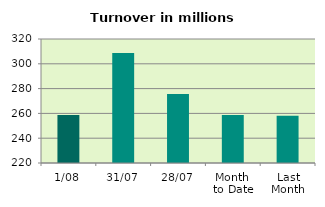
| Category | Series 0 |
|---|---|
| 1/08 | 258.743 |
| 31/07 | 308.8 |
| 28/07 | 275.631 |
| Month 
to Date | 258.743 |
| Last
Month | 258.125 |